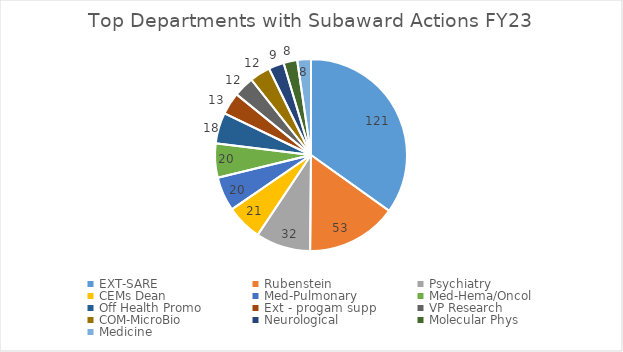
| Category | FY23 |
|---|---|
| EXT-SARE | 121 |
| Rubenstein | 53 |
| Psychiatry | 32 |
| CEMs Dean | 21 |
| Med-Pulmonary | 20 |
| Med-Hema/Oncol | 20 |
| Off Health Promo | 18 |
| Ext - progam supp | 13 |
| VP Research | 12 |
| COM-MicroBio | 12 |
| Neurological | 9 |
| Molecular Phys | 8 |
| Medicine | 8 |